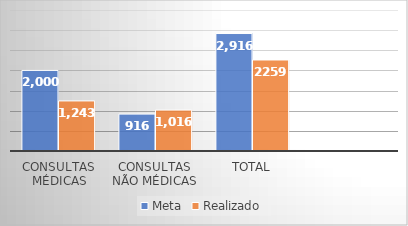
| Category | Meta | Realizado |
|---|---|---|
| Consultas Médicas | 2000 | 1243 |
| Consultas não médicas | 916 | 1016 |
| Total | 2916 | 2259 |